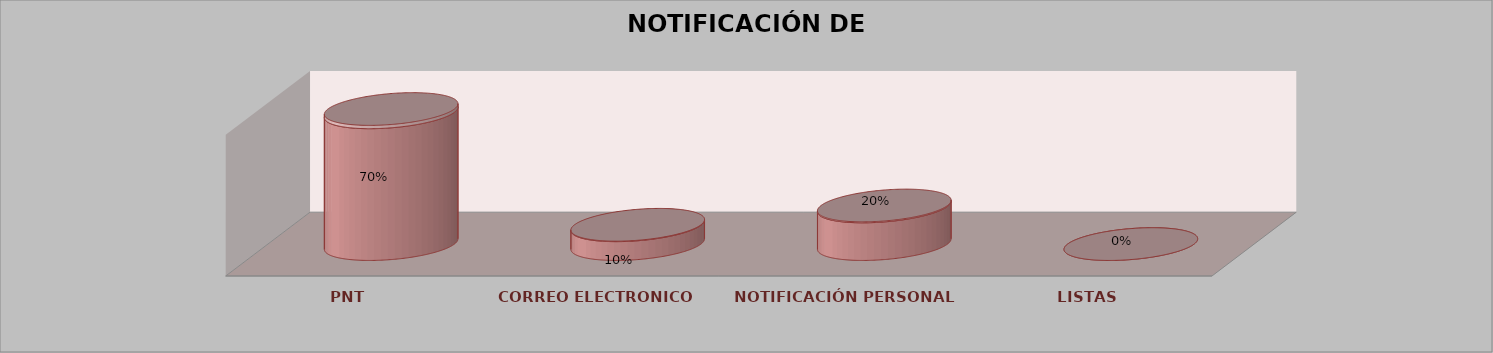
| Category | Series 0 | Series 1 | Series 2 | Series 3 | Series 4 |
|---|---|---|---|---|---|
| PNT |  |  |  | 28 | 0.7 |
| CORREO ELECTRONICO |  |  |  | 4 | 0.1 |
| NOTIFICACIÓN PERSONAL |  |  |  | 8 | 0.2 |
| LISTAS |  |  |  | 0 | 0 |